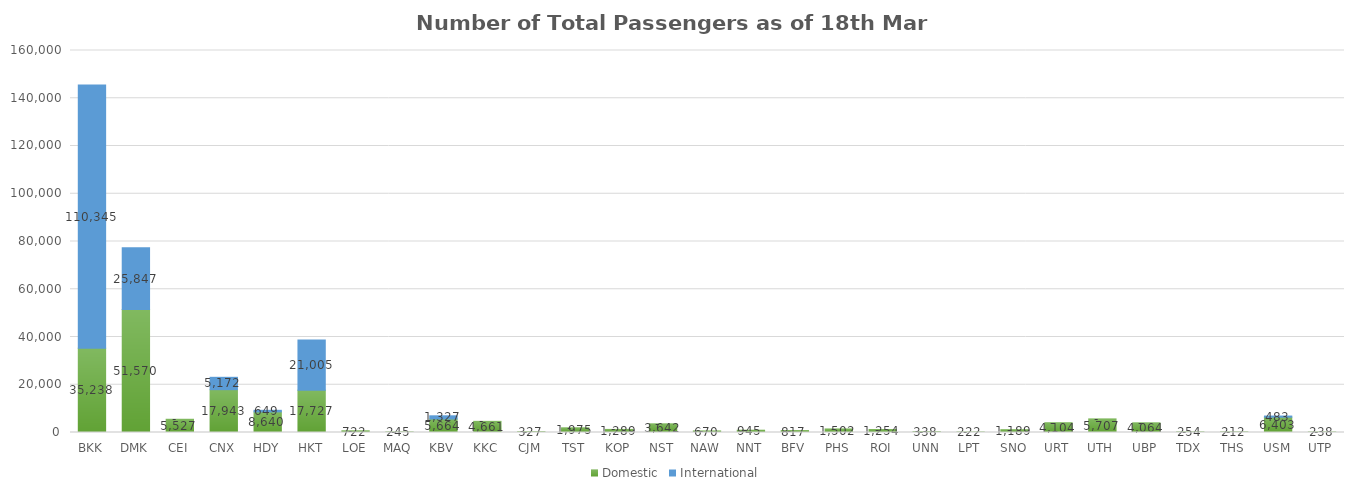
| Category | Domestic | International |
|---|---|---|
| BKK | 35238 | 110345 |
| DMK | 51570 | 25847 |
| CEI | 5527 | 0 |
| CNX | 17943 | 5172 |
| HDY | 8640 | 649 |
| HKT | 17727 | 21005 |
| LOE | 722 | 0 |
| MAQ | 245 | 0 |
| KBV | 5664 | 1327 |
| KKC | 4661 | 0 |
| CJM | 327 | 0 |
| TST | 1975 | 0 |
| KOP | 1289 | 0 |
| NST | 3642 | 0 |
| NAW | 670 | 0 |
| NNT | 945 | 0 |
| BFV | 817 | 0 |
| PHS | 1502 | 0 |
| ROI | 1254 | 0 |
| UNN | 338 | 0 |
| LPT | 222 | 0 |
| SNO | 1189 | 0 |
| URT | 4104 | 0 |
| UTH | 5707 | 0 |
| UBP | 4064 | 0 |
| TDX | 254 | 0 |
| THS | 212 | 0 |
| USM | 6403 | 483 |
| UTP | 238 | 0 |